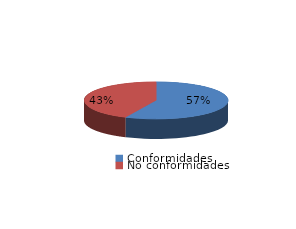
| Category | Series 0 |
|---|---|
| Conformidades | 9745 |
| No conformidades | 7389 |